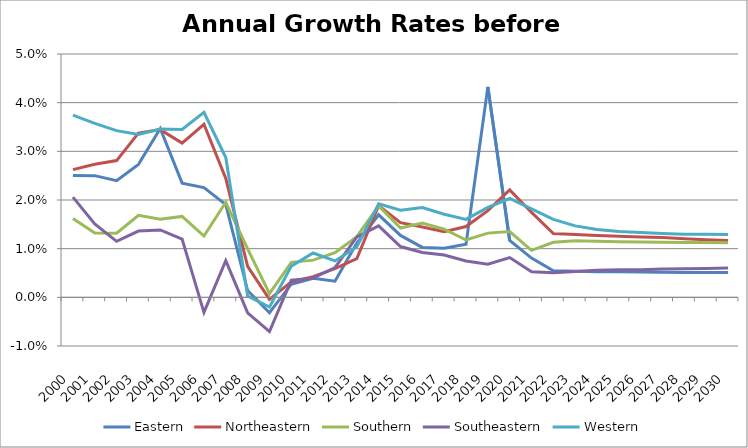
| Category | Eastern | Northeastern | Southern | Southeastern | Western |
|---|---|---|---|---|---|
| 2000.0 | 0.025 | 0.026 | 0.016 | 0.021 | 0.037 |
| 2001.0 | 0.025 | 0.027 | 0.013 | 0.015 | 0.036 |
| 2002.0 | 0.024 | 0.028 | 0.013 | 0.012 | 0.034 |
| 2003.0 | 0.027 | 0.034 | 0.017 | 0.014 | 0.033 |
| 2004.0 | 0.035 | 0.034 | 0.016 | 0.014 | 0.035 |
| 2005.0 | 0.023 | 0.032 | 0.017 | 0.012 | 0.034 |
| 2006.0 | 0.023 | 0.036 | 0.013 | -0.003 | 0.038 |
| 2007.0 | 0.019 | 0.024 | 0.02 | 0.008 | 0.029 |
| 2008.0 | 0.001 | 0.006 | 0.01 | -0.003 | 0 |
| 2009.0 | -0.003 | 0 | 0.001 | -0.007 | -0.002 |
| 2010.0 | 0.003 | 0.003 | 0.007 | 0.004 | 0.006 |
| 2011.0 | 0.004 | 0.004 | 0.008 | 0.004 | 0.009 |
| 2012.0 | 0.003 | 0.006 | 0.009 | 0.006 | 0.007 |
| 2013.0 | 0.011 | 0.008 | 0.012 | 0.012 | 0.01 |
| 2014.0 | 0.017 | 0.019 | 0.019 | 0.015 | 0.019 |
| 2015.0 | 0.013 | 0.015 | 0.014 | 0.01 | 0.018 |
| 2016.0 | 0.01 | 0.014 | 0.015 | 0.009 | 0.018 |
| 2017.0 | 0.01 | 0.013 | 0.014 | 0.009 | 0.017 |
| 2018.0 | 0.011 | 0.015 | 0.012 | 0.007 | 0.016 |
| 2019.0 | 0.043 | 0.018 | 0.013 | 0.007 | 0.018 |
| 2020.0 | 0.012 | 0.022 | 0.014 | 0.008 | 0.02 |
| 2021.0 | 0.008 | 0.017 | 0.01 | 0.005 | 0.018 |
| 2022.0 | 0.005 | 0.013 | 0.011 | 0.005 | 0.016 |
| 2023.0 | 0.005 | 0.013 | 0.012 | 0.005 | 0.015 |
| 2024.0 | 0.005 | 0.013 | 0.012 | 0.006 | 0.014 |
| 2025.0 | 0.005 | 0.013 | 0.011 | 0.006 | 0.014 |
| 2026.0 | 0.005 | 0.012 | 0.011 | 0.006 | 0.013 |
| 2027.0 | 0.005 | 0.012 | 0.011 | 0.006 | 0.013 |
| 2028.0 | 0.005 | 0.012 | 0.011 | 0.006 | 0.013 |
| 2029.0 | 0.005 | 0.012 | 0.011 | 0.006 | 0.013 |
| 2030.0 | 0.005 | 0.012 | 0.011 | 0.006 | 0.013 |